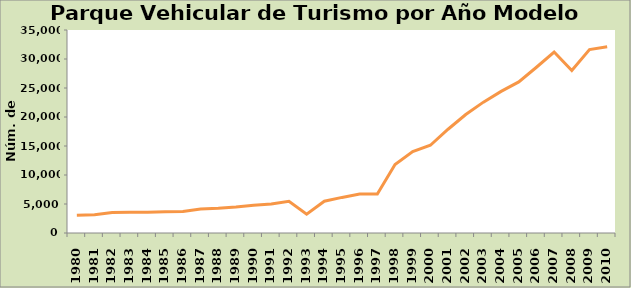
| Category | Series 0 |
|---|---|
| 1980.0 | 3070 |
| 1981.0 | 3150 |
| 1982.0 | 3550 |
| 1983.0 | 3589 |
| 1984.0 | 3596 |
| 1985.0 | 3674 |
| 1986.0 | 3718 |
| 1987.0 | 4127 |
| 1988.0 | 4266 |
| 1989.0 | 4476 |
| 1990.0 | 4782 |
| 1991.0 | 5005 |
| 1992.0 | 5481 |
| 1993.0 | 3240 |
| 1994.0 | 5476 |
| 1995.0 | 6137 |
| 1996.0 | 6706 |
| 1997.0 | 6729 |
| 1998.0 | 11793 |
| 1999.0 | 14048 |
| 2000.0 | 15124 |
| 2001.0 | 17889 |
| 2002.0 | 20424 |
| 2003.0 | 22561 |
| 2004.0 | 24419 |
| 2005.0 | 26044 |
| 2006.0 | 28579 |
| 2007.0 | 31203 |
| 2008.0 | 28008 |
| 2009.0 | 31619 |
| 2010.0 | 32105 |